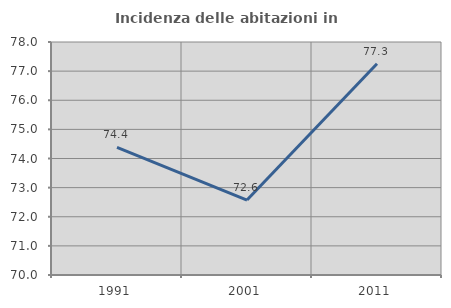
| Category | Incidenza delle abitazioni in proprietà  |
|---|---|
| 1991.0 | 74.384 |
| 2001.0 | 72.574 |
| 2011.0 | 77.253 |